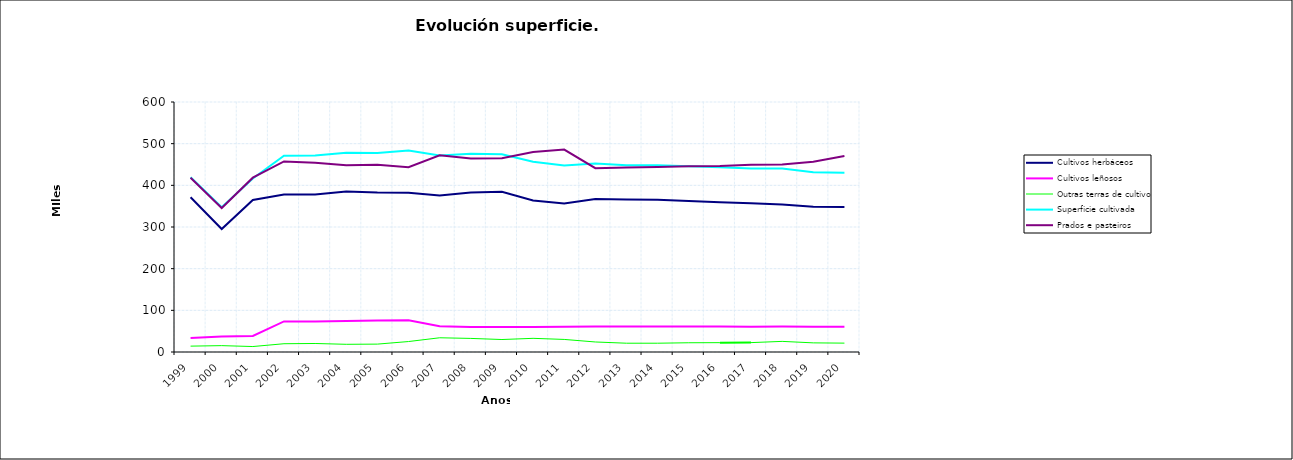
| Category | Cultivos herbáceos | Cultivos leñosos | Outras terras de cultivo | Superficie cultivada | Prados e pasteiros |
|---|---|---|---|---|---|
| 1999.0 | 371315 | 33840 | 14093 | 419248 | 418338 |
| 2000.0 | 295178 | 37200 | 15271 | 347649 | 345609 |
| 2001.0 | 365011 | 38534 | 13088 | 416633 | 418346 |
| 2002.0 | 377882 | 73349 | 19842 | 471073 | 457411 |
| 2003.0 | 378136 | 73178 | 20413 | 471727 | 454264 |
| 2004.0 | 385369 | 74294 | 18476 | 478139 | 447932 |
| 2005.0 | 382524 | 75897 | 18901 | 477322 | 449161 |
| 2006.0 | 382111 | 76316 | 25109 | 483536 | 443399 |
| 2007.0 | 375705.25 | 61616.22 | 34129.947 | 471451.417 | 472221.153 |
| 2008.0 | 382915.79 | 60049.929 | 32593.548 | 475559.267 | 464270.125 |
| 2009.0 | 384709.241 | 60030.463 | 29930.207 | 474669.911 | 464945.966 |
| 2010.0 | 363590.792 | 60164.325 | 32810.257 | 456565.374 | 479902.855 |
| 2011.0 | 356706.318 | 60571.697 | 30182.798 | 447460.813 | 485744.249 |
| 2012.0 | 367138 | 61165 | 24069 | 452372 | 441152 |
| 2013.0 | 365749.951 | 61335.678 | 21088.602 | 448174.231 | 443077.31 |
| 2014.0 | 365507.762 | 61346.461 | 21109.39 | 447963.613 | 443986.713 |
| 2015.0 | 362191 | 61336 | 22168 | 445695 | 445511 |
| 2016.0 | 359629.031 | 61076.378 | 22412.254 | 443117.662 | 446383.275 |
| 2017.0 | 356843.003 | 60876.462 | 22521.368 | 440240.833 | 449653.437 |
| 2018.0 | 353830.488 | 61087.44 | 25463.428 | 440381.355 | 450254.555 |
| 2019.0 | 348885.506 | 60572.715 | 21925.158 | 431383.378 | 456652.702 |
| 2020.0 | 348118.083 | 60769.834 | 21263.131 | 430151.048 | 470457.682 |